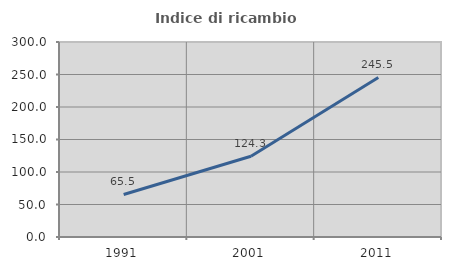
| Category | Indice di ricambio occupazionale  |
|---|---|
| 1991.0 | 65.455 |
| 2001.0 | 124.324 |
| 2011.0 | 245.455 |